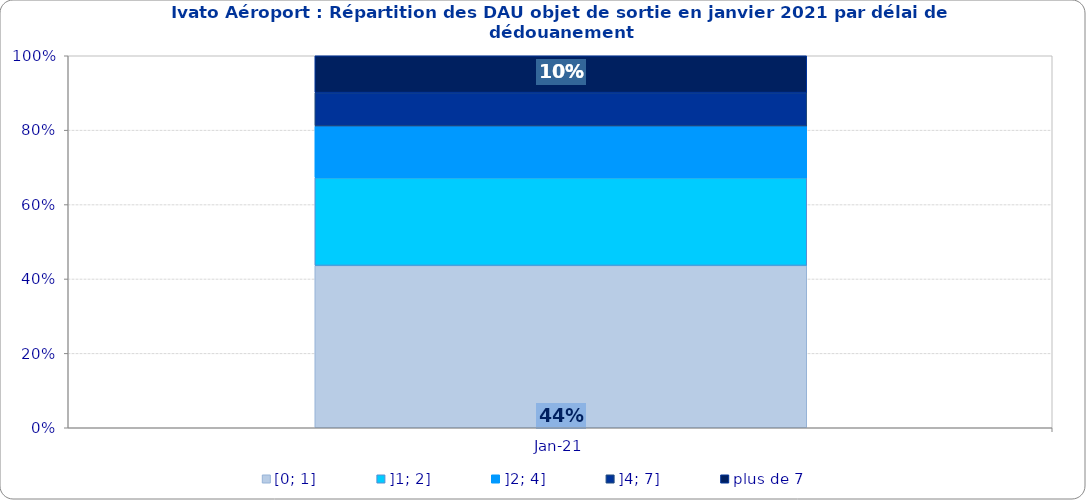
| Category | [0; 1] | ]1; 2] | ]2; 4] | ]4; 7] | plus de 7 |
|---|---|---|---|---|---|
| 2021-01-01 | 0.436 | 0.236 | 0.139 | 0.09 | 0.099 |